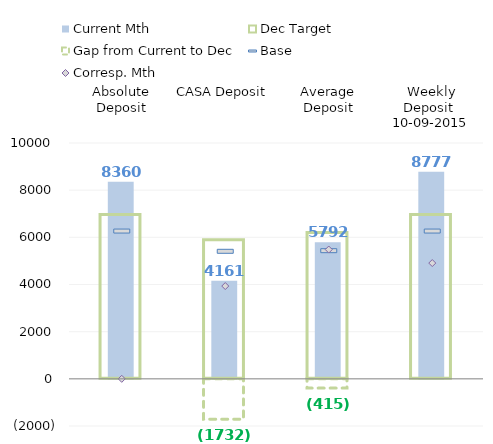
| Category | Current Mth |
|---|---|
| Absolute Deposit | 8359.874 |
| CASA Deposit | 4160.844 |
| Average Deposit | 5791.833 |
| Weekly Deposit  10-09-2015 | 8776.695 |